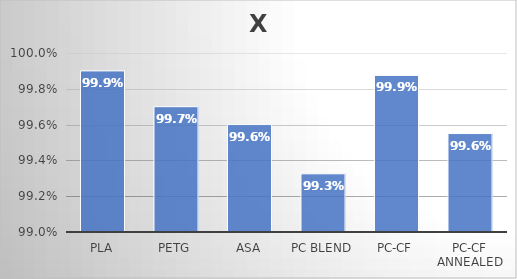
| Category | X |
|---|---|
| PLA | 0.999 |
| PETG | 0.997 |
| ASA | 0.996 |
| PC blend | 0.993 |
| PC-CF | 0.999 |
| PC-CF annealed | 0.996 |